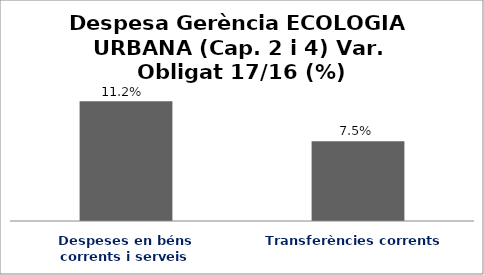
| Category | Series 0 |
|---|---|
| Despeses en béns corrents i serveis | 0.112 |
| Transferències corrents | 0.075 |